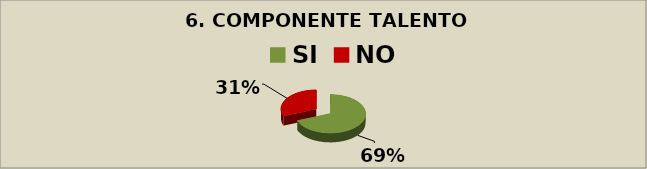
| Category | Series 0 |
|---|---|
| SI | 0.69 |
| NO | 0.31 |